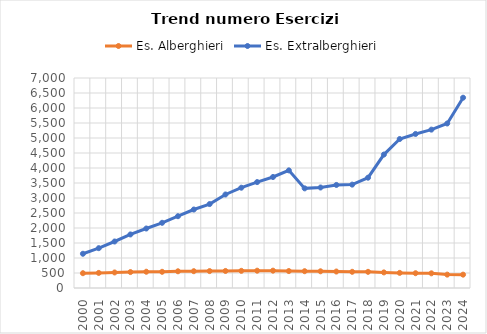
| Category | Es. Alberghieri | Es. Extralberghieri |
|---|---|---|
| 2000.0 | 493 | 1141 |
| 2001.0 | 503 | 1328 |
| 2002.0 | 518 | 1550 |
| 2003.0 | 531 | 1785 |
| 2004.0 | 542 | 1983 |
| 2005.0 | 540 | 2173 |
| 2006.0 | 557 | 2393 |
| 2007.0 | 560 | 2616 |
| 2008.0 | 564 | 2798 |
| 2009.0 | 568 | 3117 |
| 2010.0 | 572 | 3343 |
| 2011.0 | 577 | 3531 |
| 2012.0 | 578 | 3700 |
| 2013.0 | 565 | 3921 |
| 2014.0 | 560 | 3321 |
| 2015.0 | 557 | 3350 |
| 2016.0 | 549 | 3435 |
| 2017.0 | 540 | 3446 |
| 2018.0 | 539 | 3677 |
| 2019.0 | 520 | 4448 |
| 2020.0 | 504 | 4966 |
| 2021.0 | 493 | 5135 |
| 2022.0 | 489 | 5279 |
| 2023.0 | 446 | 5484 |
| 2024.0 | 445 | 6343 |